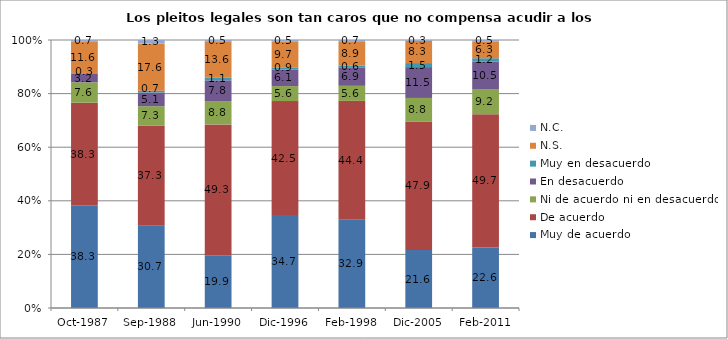
| Category | Muy de acuerdo | De acuerdo | Ni de acuerdo ni en desacuerdo | En desacuerdo | Muy en desacuerdo | N.S. | N.C. |
|---|---|---|---|---|---|---|---|
| Oct-1987 | 38.3 | 38.3 | 7.6 | 3.2 | 0.3 | 11.6 | 0.7 |
| Sep-1988 | 30.7 | 37.3 | 7.3 | 5.1 | 0.7 | 17.6 | 1.3 |
| Jun-1990 | 19.9 | 49.3 | 8.8 | 7.8 | 1.1 | 13.6 | 0.5 |
| Dic-1996 | 34.7 | 42.5 | 5.6 | 6.1 | 0.9 | 9.7 | 0.5 |
| Feb-1998 | 32.9 | 44.4 | 5.6 | 6.9 | 0.6 | 8.9 | 0.7 |
| Dic-2005 | 21.6 | 47.9 | 8.8 | 11.5 | 1.5 | 8.3 | 0.3 |
| Feb-2011 | 22.6 | 49.7 | 9.2 | 10.5 | 1.2 | 6.3 | 0.5 |